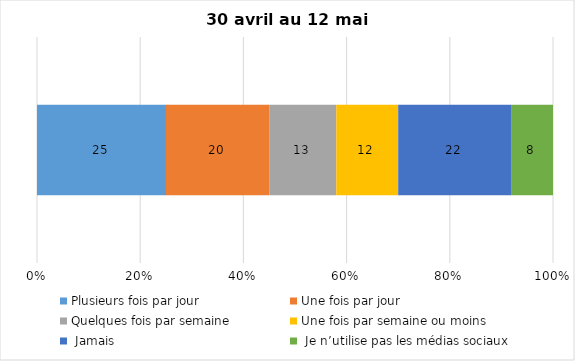
| Category | Plusieurs fois par jour | Une fois par jour | Quelques fois par semaine   | Une fois par semaine ou moins   |  Jamais   |  Je n’utilise pas les médias sociaux |
|---|---|---|---|---|---|---|
| 0 | 25 | 20 | 13 | 12 | 22 | 8 |